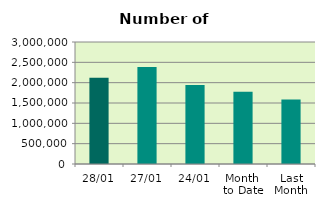
| Category | Series 0 |
|---|---|
| 28/01 | 2118980 |
| 27/01 | 2387568 |
| 24/01 | 1944482 |
| Month 
to Date | 1779544.526 |
| Last
Month | 1583843.3 |